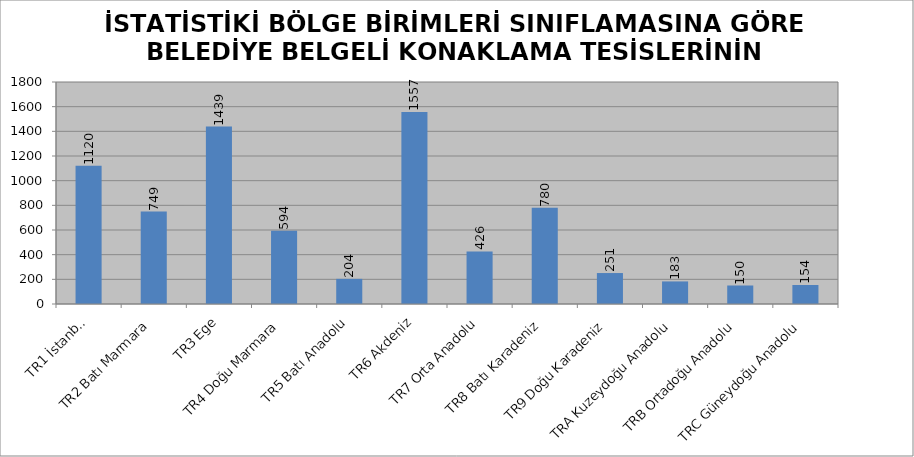
| Category | BELEDİYE BELGELİ TESİSLER |
|---|---|
| TR1 İstanbul | 1120 |
| TR2 Batı Marmara | 749 |
| TR3 Ege | 1439 |
| TR4 Doğu Marmara | 594 |
| TR5 Batı Anadolu | 204 |
| TR6 Akdeniz | 1557 |
| TR7 Orta Anadolu | 426 |
| TR8 Batı Karadeniz | 780 |
| TR9 Doğu Karadeniz | 251 |
| TRA Kuzeydoğu Anadolu | 183 |
| TRB Ortadoğu Anadolu | 150 |
| TRC Güneydoğu Anadolu | 154 |